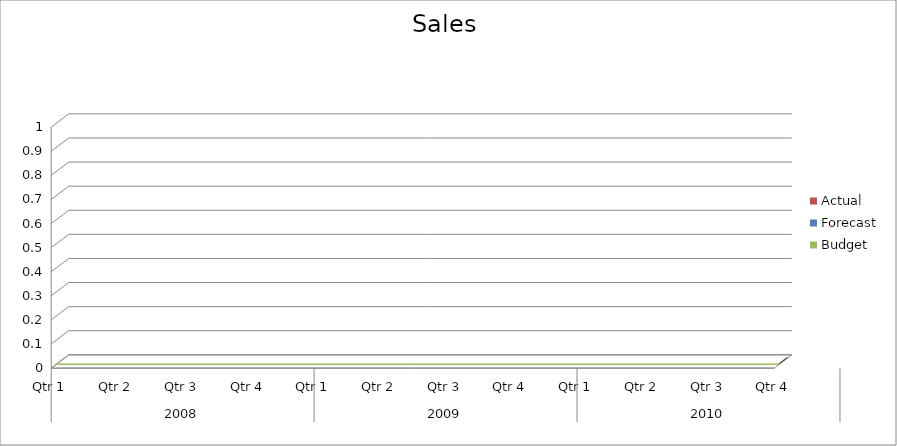
| Category | Budget | Forecast | Actual |
|---|---|---|---|
| 0 | 3330 | 2390 | 2400 |
| 1 | 1220 | 2020 | 1350 |
| 2 | 2870 | 1130 | 2510 |
| 3 | 1510 | 1240 | 3420 |
| 4 | 2390 | 1040 | 1720 |
| 5 | 2440 | 2660 | 610 |
| 6 | 1560 | 3130 | 2520 |
| 7 | 1070 | 2850 | 1310 |
| 8 | 2140 | 900 | 1170 |
| 9 | 2880 | 2750 | 1630 |
| 10 | 3230 | 3280 | 3030 |
| 11 | 2910 | 1630 | 2560 |